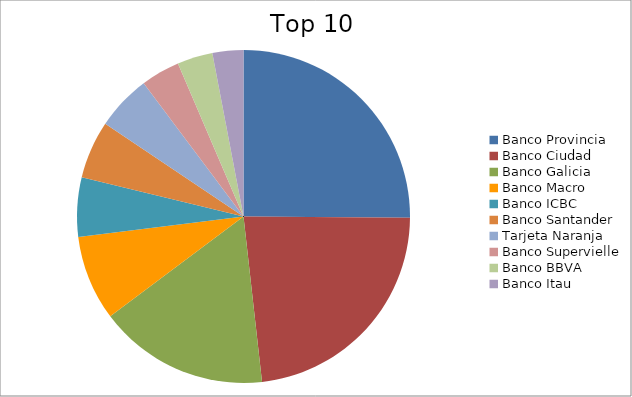
| Category | Series 0 |
|---|---|
| Banco Provincia | 25.11 |
| Banco Ciudad | 23.11 |
| Banco Galicia | 16.54 |
| Banco Macro | 8.28 |
| Banco ICBC | 5.75 |
| Banco Santander | 5.61 |
| Tarjeta Naranja | 5.36 |
| Banco Supervielle | 3.79 |
| Banco BBVA | 3.44 |
| Banco Itau | 3 |